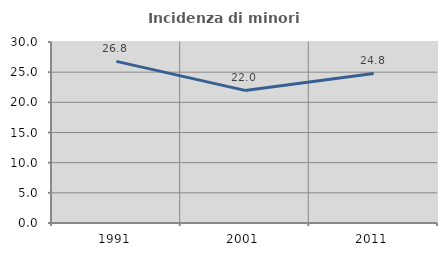
| Category | Incidenza di minori stranieri |
|---|---|
| 1991.0 | 26.786 |
| 2001.0 | 21.978 |
| 2011.0 | 24.796 |